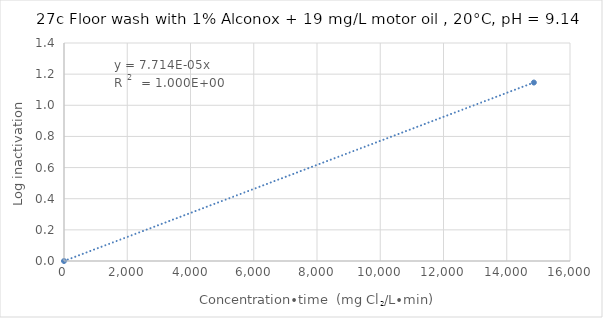
| Category | Series 0 |
|---|---|
| 0.0 | 0 |
| 14857.428714357178 | 1.146 |